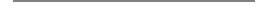
| Category | Red | Orange | Yellow | Green | None |
|---|---|---|---|---|---|
| 0 | 0 | 0 | 0 | 0 | 1 |